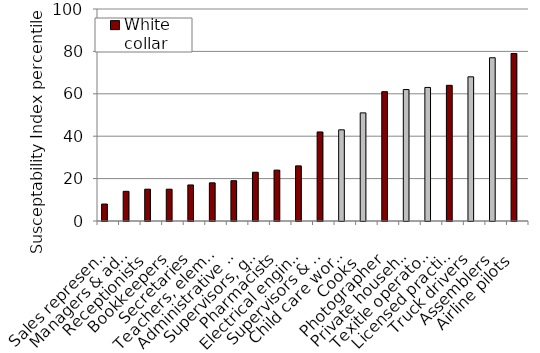
| Category | White collar | Blue collar |
|---|---|---|
| Sales representatives | 8 | 0 |
| Managers & administrators | 14 | 0 |
| Receptionists | 15 | 0 |
| Bookkeepers | 15 | 0 |
| Secretaries | 17 | 0 |
| Teachers, elementary school | 18 | 0 |
| Administrative support | 19 | 0 |
| Supervisors, general office | 23 | 0 |
| Pharmacists | 24 | 0 |
| Electrical engineers | 26 | 0 |
| Supervisors & proprietors  | 42 | 0 |
| Child care worker | 43 | 0 |
| Cooks  | 51 | 0 |
| Photographer | 61 | 0 |
| Private household cleaners | 62 | 0 |
| Texitle operators | 63 | 0 |
| Licensed practical nurses | 64 | 0 |
| Truck drivers | 68 | 0 |
| Assemblers | 77 | 0 |
| Airline pilots | 79 | 0 |